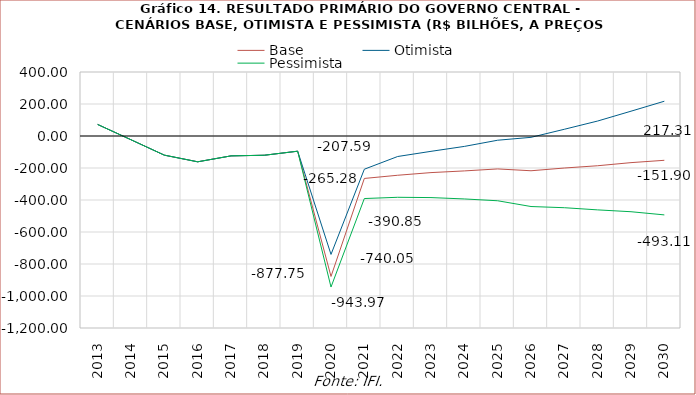
| Category | Base | Otimista | Pessimista |
|---|---|---|---|
| 2013.0 | 72159.145 | 72159.145 | 72159.145 |
| 2014.0 | -23482.403 | -23482.403 | -23482.403 |
| 2015.0 | -119647.227 | -119647.227 | -119647.227 |
| 2016.0 | -161275.625 | -161275.625 | -161275.625 |
| 2017.0 | -124261.487 | -124261.487 | -124261.487 |
| 2018.0 | -120221.282 | -120221.282 | -120221.282 |
| 2019.0 | -95016.947 | -95016.947 | -95016.947 |
| 2020.0 | -877752.989 | -740054.108 | -943974.894 |
| 2021.0 | -265275.518 | -207587.4 | -390851.772 |
| 2022.0 | -245350.524 | -128192.867 | -383074.769 |
| 2023.0 | -228757.722 | -95860.717 | -384935.018 |
| 2024.0 | -218204.734 | -65052.101 | -393380.92 |
| 2025.0 | -205782.23 | -26431.102 | -404723.97 |
| 2026.0 | -217243.344 | -8361.461 | -440751.625 |
| 2027.0 | -200123.718 | 42021.262 | -448237.262 |
| 2028.0 | -185880.923 | 93581.336 | -461785.929 |
| 2029.0 | -166446.121 | 155026.407 | -473318.708 |
| 2030.0 | -151902.612 | 217307.219 | -493113.968 |